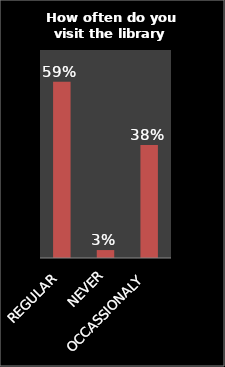
| Category | Series 0 |
|---|---|
| REGULAR | 0.593 |
| NEVER | 0.027 |
| OCCASSIONALY | 0.38 |